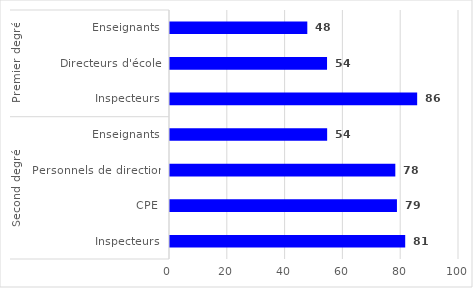
| Category | Series 0 |
|---|---|
| 0 | 47.511 |
| 1 | 54.34 |
| 2 | 85.524 |
| 3 | 54.378 |
| 4 | 77.965 |
| 5 | 78.528 |
| 6 | 81.385 |